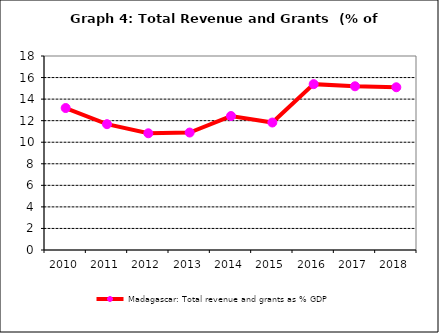
| Category | Madagascar: Total revenue and grants as % GDP |
|---|---|
| 2010.0 | 13.173 |
| 2011.0 | 11.675 |
| 2012.0 | 10.83 |
| 2013.0 | 10.897 |
| 2014.0 | 12.43 |
| 2015.0 | 11.828 |
| 2016.0 | 15.39 |
| 2017.0 | 15.19 |
| 2018.0 | 15.1 |